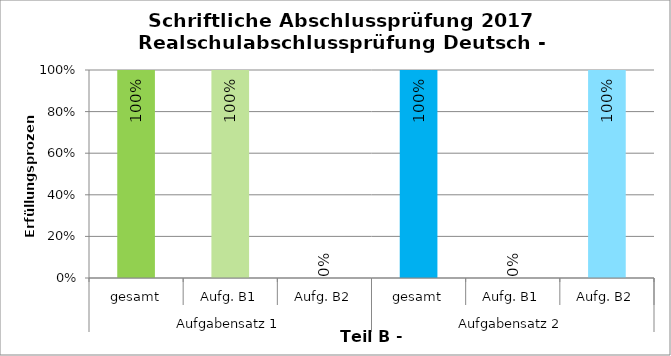
| Category | Series 0 |
|---|---|
| 0 | 1 |
| 1 | 1 |
| 2 | 0 |
| 3 | 1 |
| 4 | 0 |
| 5 | 1 |